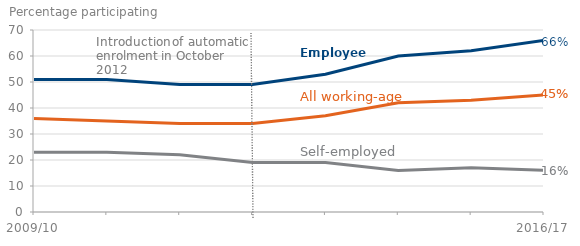
| Category | Employees | Self-employed | All |
|---|---|---|---|
| 2009/10 | 51 | 23 | 36 |
| 2010/11 | 51 | 23 | 35 |
| 2011/12 | 49 | 22 | 34 |
| 2012/13 | 49 | 19 | 34 |
| 2013/14 | 53 | 19 | 37 |
| 2014/15 | 60 | 16 | 42 |
| 2015/16 | 62 | 17 | 43 |
| 2016/17 | 66 | 16 | 45 |